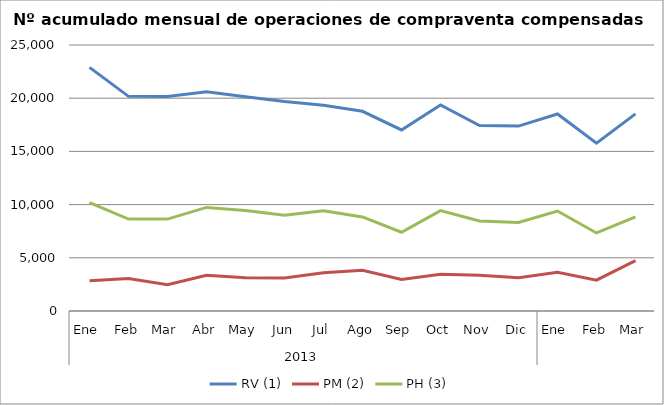
| Category | RV (1) | PM (2) | PH (3) |
|---|---|---|---|
| 0 | 22894 | 2853 | 10176 |
| 1 | 20174 | 3047 | 8641 |
| 2 | 20169 | 2472 | 8638 |
| 3 | 20616 | 3350 | 9736 |
| 4 | 20126 | 3117 | 9441 |
| 5 | 19686 | 3099 | 9000 |
| 6 | 19337 | 3588 | 9415 |
| 7 | 18769 | 3829 | 8838 |
| 8 | 17015 | 2969 | 7402 |
| 9 | 19371 | 3453 | 9435 |
| 10 | 17427 | 3359 | 8465 |
| 11 | 17377 | 3135 | 8315 |
| 12 | 18515 | 3629 | 9396 |
| 13 | 15776 | 2899 | 7337 |
| 14 | 18527 | 4739 | 8846 |